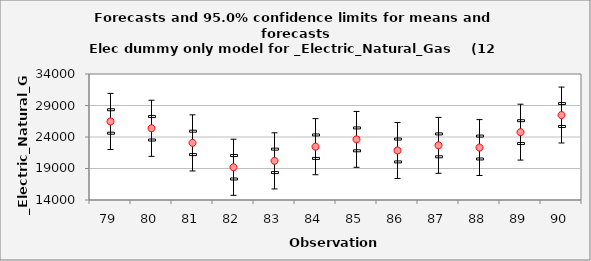
| Category | Forecast | Upper95%M | Lower95%M |
|---|---|---|---|
| 79.0 | 26466.59 | 28327.587 | 24605.592 |
| 80.0 | 25380.09 | 27241.087 | 23519.092 |
| 81.0 | 23063.59 | 24924.587 | 21202.592 |
| 82.0 | 19195.256 | 21056.254 | 17334.259 |
| 83.0 | 20212.09 | 22073.087 | 18351.092 |
| 84.0 | 22464.59 | 24325.587 | 20603.592 |
| 85.0 | 23624.436 | 25440.584 | 21808.288 |
| 86.0 | 21859.722 | 23675.869 | 20043.574 |
| 87.0 | 22673.436 | 24489.584 | 20857.288 |
| 88.0 | 22327.864 | 24144.012 | 20511.717 |
| 89.0 | 24770.15 | 26586.298 | 22954.002 |
| 90.0 | 27486.722 | 29302.869 | 25670.574 |